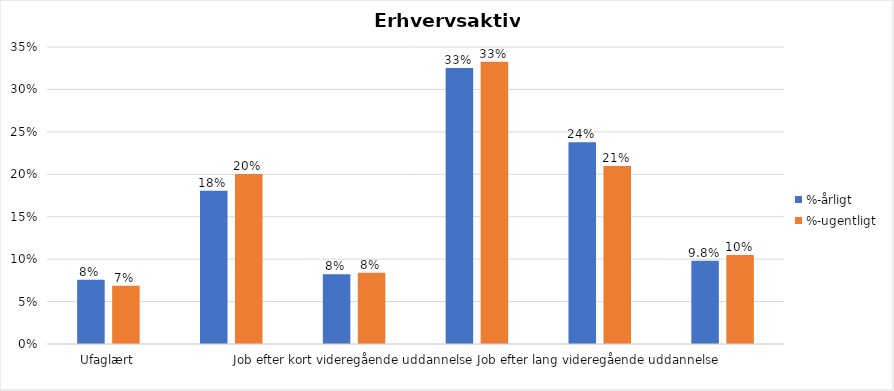
| Category | %-årligt | %-ugentligt |
|---|---|---|
| Ufaglært | 0.076 | 0.069 |
| Erhvervsfagligt job | 0.181 | 0.2 |
| Job efter kort videregående uddannelse | 0.082 | 0.084 |
| Job efter mellemlang videregående uddannelse | 0.325 | 0.333 |
| Job efter lang videregående uddannelse | 0.238 | 0.21 |
| Selvstændig | 0.098 | 0.105 |